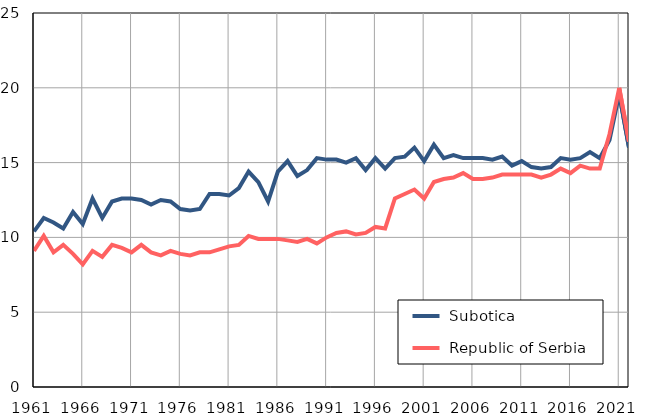
| Category |  Subotica |  Republic of Serbia |
|---|---|---|
| 1961.0 | 10.4 | 9.1 |
| 1962.0 | 11.3 | 10.1 |
| 1963.0 | 11 | 9 |
| 1964.0 | 10.6 | 9.5 |
| 1965.0 | 11.7 | 8.9 |
| 1966.0 | 10.9 | 8.2 |
| 1967.0 | 12.6 | 9.1 |
| 1968.0 | 11.3 | 8.7 |
| 1969.0 | 12.4 | 9.5 |
| 1970.0 | 12.6 | 9.3 |
| 1971.0 | 12.6 | 9 |
| 1972.0 | 12.5 | 9.5 |
| 1973.0 | 12.2 | 9 |
| 1974.0 | 12.5 | 8.8 |
| 1975.0 | 12.4 | 9.1 |
| 1976.0 | 11.9 | 8.9 |
| 1977.0 | 11.8 | 8.8 |
| 1978.0 | 11.9 | 9 |
| 1979.0 | 12.9 | 9 |
| 1980.0 | 12.9 | 9.2 |
| 1981.0 | 12.8 | 9.4 |
| 1982.0 | 13.3 | 9.5 |
| 1983.0 | 14.4 | 10.1 |
| 1984.0 | 13.7 | 9.9 |
| 1985.0 | 12.4 | 9.9 |
| 1986.0 | 14.4 | 9.9 |
| 1987.0 | 15.1 | 9.8 |
| 1988.0 | 14.1 | 9.7 |
| 1989.0 | 14.5 | 9.9 |
| 1990.0 | 15.3 | 9.6 |
| 1991.0 | 15.2 | 10 |
| 1992.0 | 15.2 | 10.3 |
| 1993.0 | 15 | 10.4 |
| 1994.0 | 15.3 | 10.2 |
| 1995.0 | 14.5 | 10.3 |
| 1996.0 | 15.3 | 10.7 |
| 1997.0 | 14.6 | 10.6 |
| 1998.0 | 15.3 | 12.6 |
| 1999.0 | 15.4 | 12.9 |
| 2000.0 | 16 | 13.2 |
| 2001.0 | 15.1 | 12.6 |
| 2002.0 | 16.2 | 13.7 |
| 2003.0 | 15.3 | 13.9 |
| 2004.0 | 15.5 | 14 |
| 2005.0 | 15.3 | 14.3 |
| 2006.0 | 15.3 | 13.9 |
| 2007.0 | 15.3 | 13.9 |
| 2008.0 | 15.2 | 14 |
| 2009.0 | 15.4 | 14.2 |
| 2010.0 | 14.8 | 14.2 |
| 2011.0 | 15.1 | 14.2 |
| 2012.0 | 14.7 | 14.2 |
| 2013.0 | 14.6 | 14 |
| 2014.0 | 14.7 | 14.2 |
| 2015.0 | 15.3 | 14.6 |
| 2016.0 | 15.2 | 14.3 |
| 2017.0 | 15.3 | 14.8 |
| 2018.0 | 15.7 | 14.6 |
| 2019.0 | 15.3 | 14.6 |
| 2020.0 | 16.5 | 16.9 |
| 2021.0 | 19.6 | 20 |
| 2022.0 | 16 | 16.4 |